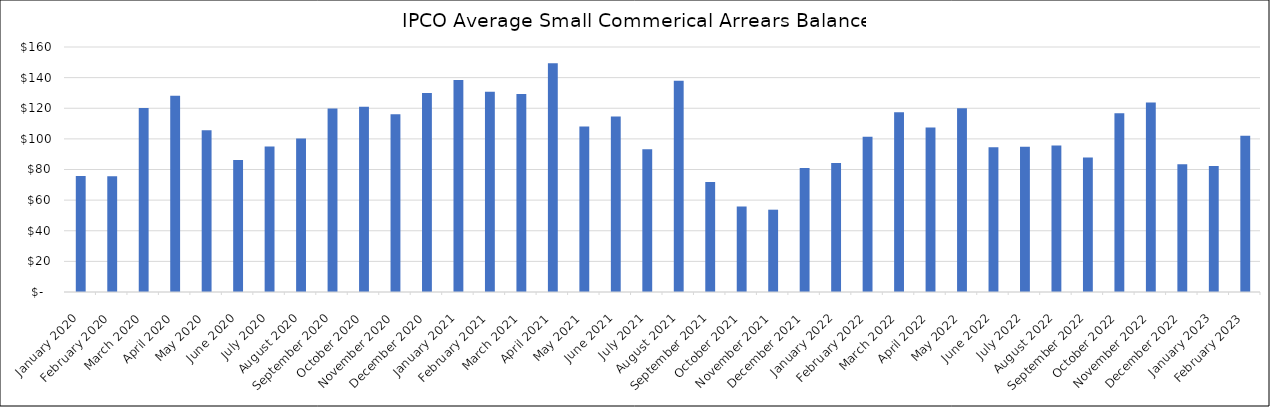
| Category | Average Arrears Balance |
|---|---|
| 2020-01-01 | 75.734 |
| 2020-02-01 | 75.652 |
| 2020-03-01 | 120.082 |
| 2020-04-01 | 128.188 |
| 2020-05-01 | 105.552 |
| 2020-06-01 | 86.153 |
| 2020-07-01 | 95.089 |
| 2020-08-01 | 100.259 |
| 2020-09-01 | 119.832 |
| 2020-10-01 | 120.996 |
| 2020-11-01 | 116.157 |
| 2020-12-01 | 129.989 |
| 2021-01-01 | 138.495 |
| 2021-02-01 | 130.838 |
| 2021-03-01 | 129.289 |
| 2021-04-01 | 149.413 |
| 2021-05-01 | 108.12 |
| 2021-06-01 | 114.65 |
| 2021-07-01 | 93.202 |
| 2021-08-01 | 137.886 |
| 2021-09-01 | 71.83 |
| 2021-10-01 | 55.859 |
| 2021-11-01 | 53.754 |
| 2021-12-01 | 80.943 |
| 2022-01-01 | 84.292 |
| 2022-02-01 | 101.459 |
| 2022-03-01 | 117.45 |
| 2022-04-01 | 107.357 |
| 2022-05-01 | 120.015 |
| 2022-06-01 | 94.604 |
| 2022-07-01 | 94.794 |
| 2022-08-01 | 95.72 |
| 2022-09-01 | 87.777 |
| 2022-10-01 | 116.67 |
| 2022-11-01 | 123.743 |
| 2022-12-01 | 83.42 |
| 2023-01-01 | 82.343 |
| 2023-02-01 | 102.02 |